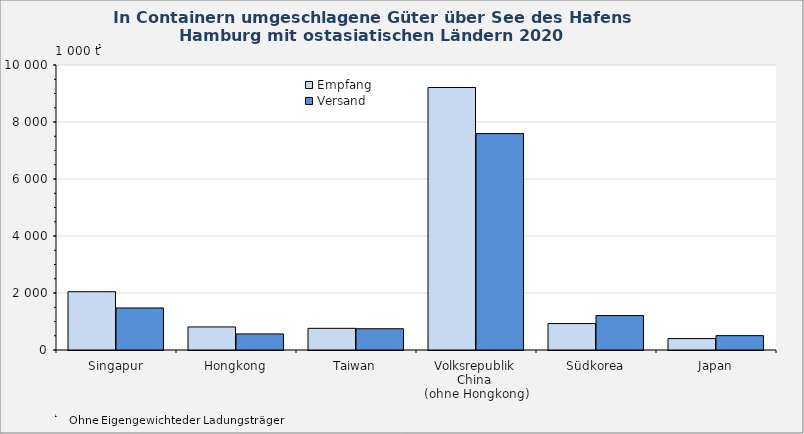
| Category | Empfang | Versand |
|---|---|---|
| Singapur | 2045 | 1475 |
| Hongkong | 809 | 564 |
| Taiwan | 760 | 746 |
| Volksrepublik 
China 
(ohne Hongkong) | 9210 | 7593 |
| Südkorea | 928 | 1208 |
| Japan | 401 | 504 |